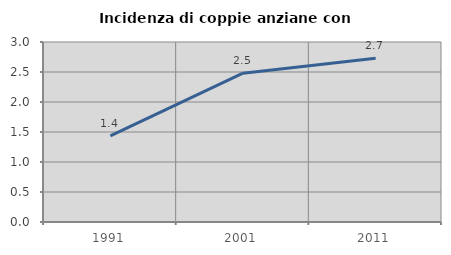
| Category | Incidenza di coppie anziane con figli |
|---|---|
| 1991.0 | 1.436 |
| 2001.0 | 2.48 |
| 2011.0 | 2.729 |